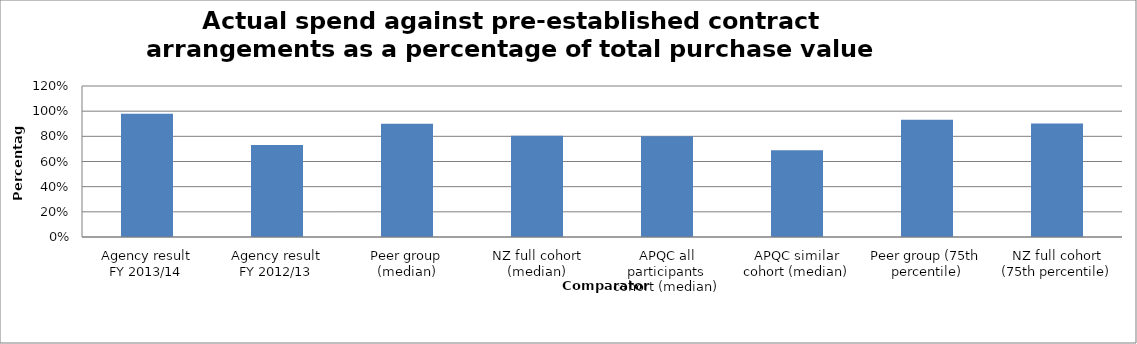
| Category | Result |
|---|---|
| Agency result
FY 2013/14 | 0.98 |
| Agency result
FY 2012/13 | 0.731 |
| Peer group (median) | 0.899 |
| NZ full cohort (median) | 0.804 |
| APQC all participants cohort (median) | 0.8 |
| APQC similar cohort (median) | 0.69 |
| Peer group (75th percentile) | 0.932 |
| NZ full cohort (75th percentile) | 0.902 |